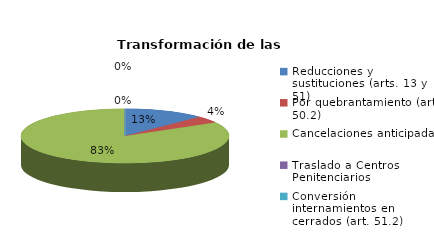
| Category | Series 0 |
|---|---|
| Reducciones y sustituciones (arts. 13 y 51) | 3 |
| Por quebrantamiento (art. 50.2) | 1 |
| Cancelaciones anticipadas | 20 |
| Traslado a Centros Penitenciarios | 0 |
| Conversión internamientos en cerrados (art. 51.2) | 0 |